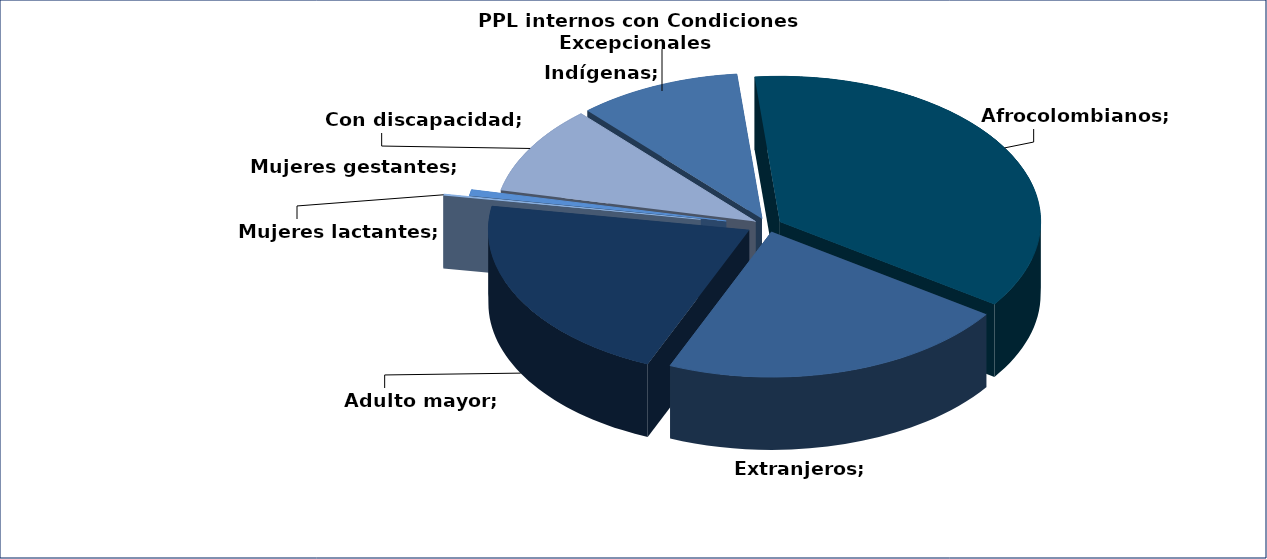
| Category | Series 0 |
|---|---|
| Indígenas | 881 |
| Afrocolombianos | 3146 |
| Extranjeros | 1892 |
| Adulto mayor | 1851 |
| Mujeres lactantes | 12 |
| Mujeres gestantes | 59 |
| Con discapacidad | 860 |